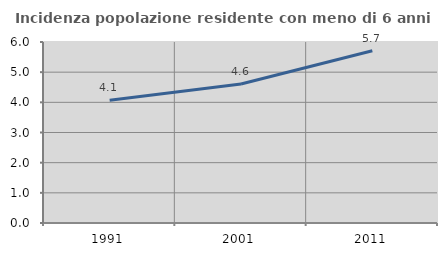
| Category | Incidenza popolazione residente con meno di 6 anni |
|---|---|
| 1991.0 | 4.073 |
| 2001.0 | 4.606 |
| 2011.0 | 5.708 |